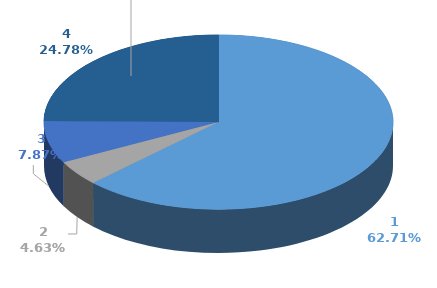
| Category | Series 0 | Series 1 |
|---|---|---|
| 0 | 1419673 |  |
| 1 | 104906 |  |
| 2 | 178120 |  |
| 3 | 561061 |  |